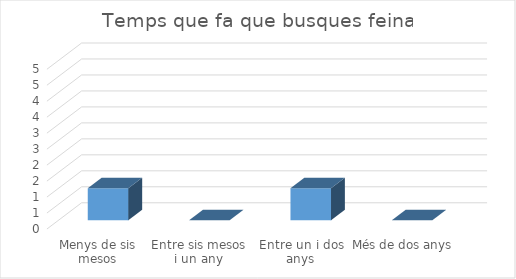
| Category | Series 0 |
|---|---|
| Menys de sis mesos | 1 |
| Entre sis mesos i un any | 0 |
| Entre un i dos anys | 1 |
| Més de dos anys | 0 |